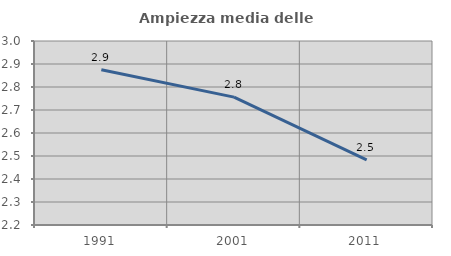
| Category | Ampiezza media delle famiglie |
|---|---|
| 1991.0 | 2.875 |
| 2001.0 | 2.756 |
| 2011.0 | 2.483 |